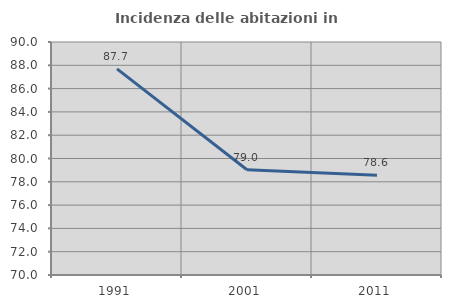
| Category | Incidenza delle abitazioni in proprietà  |
|---|---|
| 1991.0 | 87.692 |
| 2001.0 | 79.032 |
| 2011.0 | 78.571 |